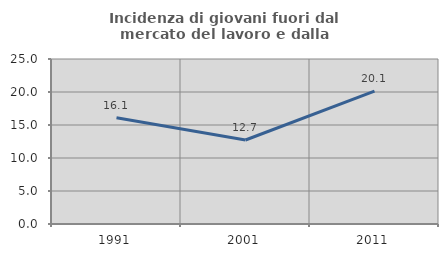
| Category | Incidenza di giovani fuori dal mercato del lavoro e dalla formazione  |
|---|---|
| 1991.0 | 16.098 |
| 2001.0 | 12.727 |
| 2011.0 | 20.13 |